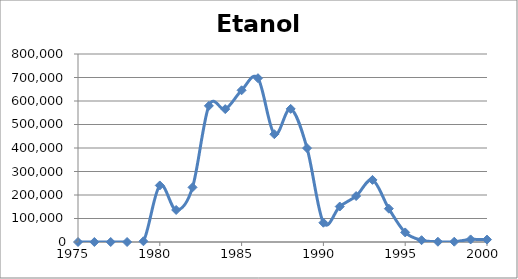
| Category | Etanol |
|---|---|
| 1975.0 | 0 |
| 1976.0 | 0 |
| 1977.0 | 0 |
| 1978.0 | 0 |
| 1979.0 | 3114 |
| 1980.0 | 240643 |
| 1981.0 | 136242 |
| 1982.0 | 232575 |
| 1983.0 | 579328 |
| 1984.0 | 565536 |
| 1985.0 | 645551 |
| 1986.0 | 697049 |
| 1987.0 | 458683 |
| 1988.0 | 566482 |
| 1989.0 | 399529 |
| 1990.0 | 81996 |
| 1991.0 | 150982 |
| 1992.0 | 195503 |
| 1993.0 | 264235 |
| 1994.0 | 141834 |
| 1995.0 | 40706 |
| 1996.0 | 7647 |
| 1997.0 | 1120 |
| 1998.0 | 1224 |
| 1999.0 | 10947 |
| 2000.0 | 10292 |
| 2001.0 | 18335 |
| 2002.0 | 55961 |
| 2003.0 | 36380 |
| 2004.0 | 50949 |
| 2005.0 | 32357 |
| 2006.0 | 1863 |
| 2007.0 | 107 |
| 2008.0 | 84 |
| 2009.0 | 70 |